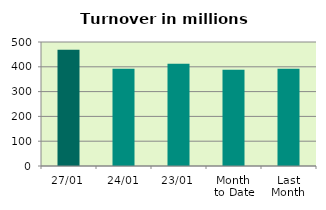
| Category | Series 0 |
|---|---|
| 27/01 | 469.229 |
| 24/01 | 392.493 |
| 23/01 | 411.912 |
| Month 
to Date | 387.966 |
| Last
Month | 391.769 |